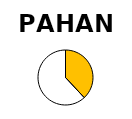
| Category | Series 1 | Series 0 |
|---|---|---|
| Operational Capacity (MW) | 79.916 | 33.996 |
| In progress (MW) | 130 | 0 |